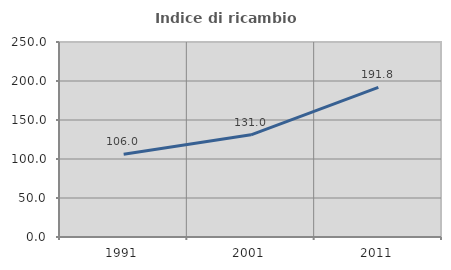
| Category | Indice di ricambio occupazionale  |
|---|---|
| 1991.0 | 105.957 |
| 2001.0 | 131 |
| 2011.0 | 191.813 |